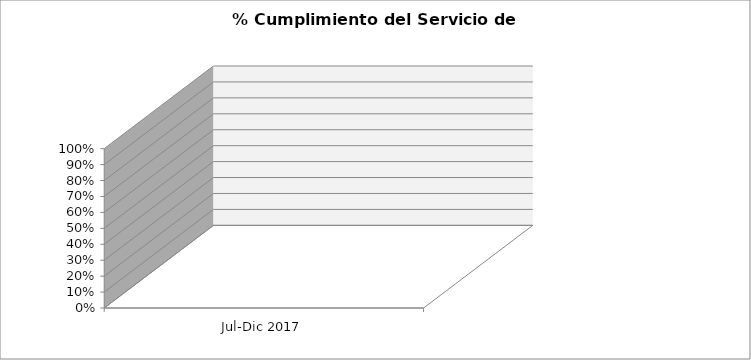
| Category | % |
|---|---|
| Jul-Dic 2017 | 0 |